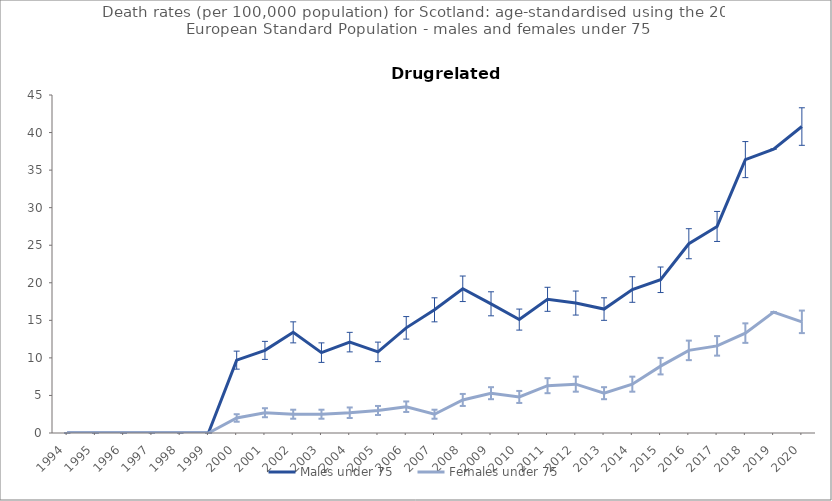
| Category | Males under 75 | Females under 75 |
|---|---|---|
| 1994.0 | 0 | 0 |
| 1995.0 | 0 | 0 |
| 1996.0 | 0 | 0 |
| 1997.0 | 0 | 0 |
| 1998.0 | 0 | 0 |
| 1999.0 | 0 | 0 |
| 2000.0 | 9.7 | 2 |
| 2001.0 | 11 | 2.7 |
| 2002.0 | 13.4 | 2.5 |
| 2003.0 | 10.7 | 2.5 |
| 2004.0 | 12.1 | 2.7 |
| 2005.0 | 10.8 | 3 |
| 2006.0 | 14 | 3.5 |
| 2007.0 | 16.4 | 2.5 |
| 2008.0 | 19.2 | 4.4 |
| 2009.0 | 17.2 | 5.3 |
| 2010.0 | 15.1 | 4.8 |
| 2011.0 | 17.8 | 6.3 |
| 2012.0 | 17.3 | 6.5 |
| 2013.0 | 16.5 | 5.3 |
| 2014.0 | 19.1 | 6.5 |
| 2015.0 | 20.4 | 8.9 |
| 2016.0 | 25.2 | 11 |
| 2017.0 | 27.5 | 11.6 |
| 2018.0 | 36.4 | 13.3 |
| 2019.0 | 37.8 | 16.1 |
| 2020.0 | 40.8 | 14.8 |